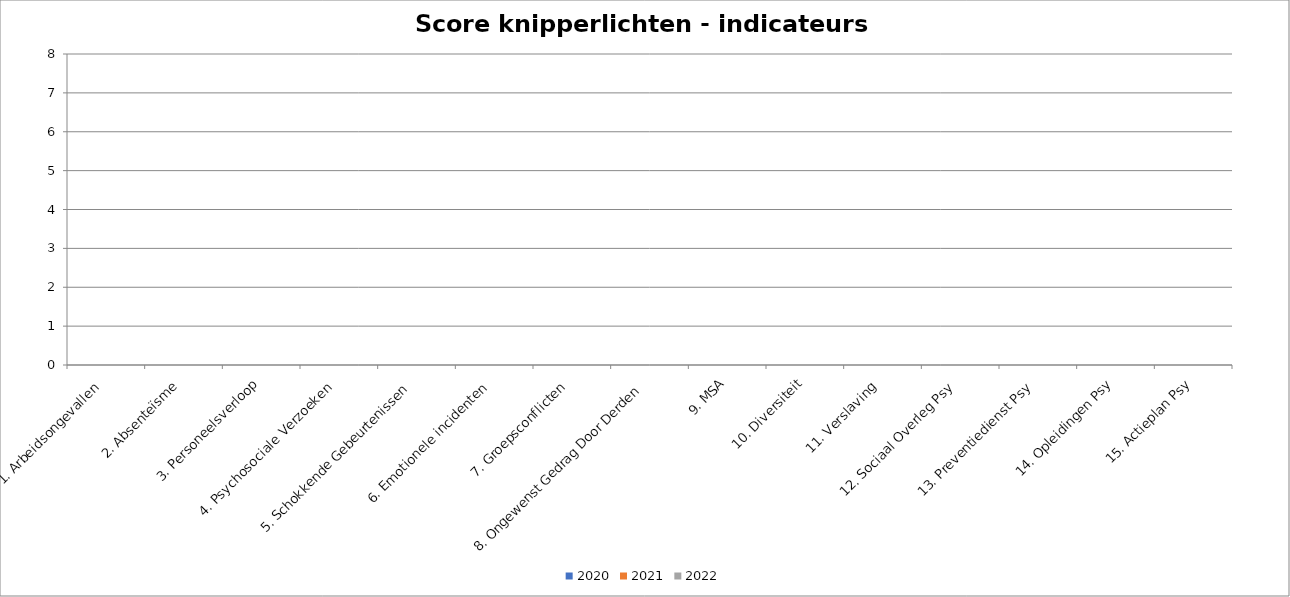
| Category | 2020 | 2021 | 2022 | D | E | F | G | H | I | J | K | L | M | N | O |
|---|---|---|---|---|---|---|---|---|---|---|---|---|---|---|---|
| 1. Arbeidsongevallen | 0 | 0 | 0 |  |  |  |  |  |  |  |  |  |  |  |  |
| 2. Absenteïsme | 0 | 0 | 0 |  |  |  |  |  |  |  |  |  |  |  |  |
| 3. Personeelsverloop | 0 | 0 | 0 |  |  |  |  |  |  |  |  |  |  |  |  |
| 4. Psychosociale Verzoeken | 0 | 0 | 0 |  |  |  |  |  |  |  |  |  |  |  |  |
| 5. Schokkende Gebeurtenissen | 0 | 0 | 0 |  |  |  |  |  |  |  |  |  |  |  |  |
| 6. Emotionele incidenten | 0 | 0 | 0 |  |  |  |  |  |  |  |  |  |  |  |  |
| 7. Groepsconflicten  | 0 | 0 | 0 |  |  |  |  |  |  |  |  |  |  |  |  |
| 8. Ongewenst Gedrag Door Derden | 0 | 0 | 0 |  |  |  |  |  |  |  |  |  |  |  |  |
| 9. MSA | 0 | 0 | 0 |  |  |  |  |  |  |  |  |  |  |  |  |
| 10. Diversiteit | 0 | 0 | 0 |  |  |  |  |  |  |  |  |  |  |  |  |
| 11. Verslaving | 0 | 0 | 0 |  |  |  |  |  |  |  |  |  |  |  |  |
| 12. Sociaal Overleg Psy | 0 | 0 | 0 |  |  |  |  |  |  |  |  |  |  |  |  |
| 13. Preventiedienst Psy | 0 | 0 | 0 |  |  |  |  |  |  |  |  |  |  |  |  |
| 14. Opleidingen Psy | 0 | 0 | 0 |  |  |  |  |  |  |  |  |  |  |  |  |
| 15. Actieplan Psy | 0 | 0 | 0 |  |  |  |  |  |  |  |  |  |  |  |  |